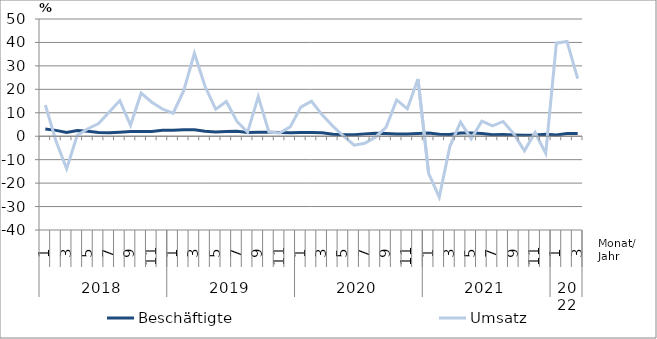
| Category | Beschäftigte | Umsatz |
|---|---|---|
| 0 | 3.1 | 13.3 |
| 1 | 2.5 | -2 |
| 2 | 1.6 | -13.9 |
| 3 | 2.4 | 0.4 |
| 4 | 2.1 | 3.2 |
| 5 | 1.6 | 5.4 |
| 6 | 1.5 | 10.3 |
| 7 | 1.7 | 15.2 |
| 8 | 2 | 4.7 |
| 9 | 2 | 18.4 |
| 10 | 2 | 14.5 |
| 11 | 2.5 | 11.6 |
| 12 | 2.6 | 9.8 |
| 13 | 2.8 | 19.4 |
| 14 | 2.8 | 35.4 |
| 15 | 2.1 | 21.3 |
| 16 | 1.8 | 11.5 |
| 17 | 2 | 14.8 |
| 18 | 2.1 | 6.3 |
| 19 | 1.6 | 1.7 |
| 20 | 1.7 | 16.9 |
| 21 | 1.7 | 1.8 |
| 22 | 1.6 | 1.4 |
| 23 | 1.5 | 4 |
| 24 | 1.6 | 12.4 |
| 25 | 1.6 | 14.9 |
| 26 | 1.5 | 9.1 |
| 27 | 0.8 | 4.3 |
| 28 | 0.6 | 0.1 |
| 29 | 0.6 | -3.8 |
| 30 | 1 | -3 |
| 31 | 1.3 | -0.4 |
| 32 | 1.2 | 3.8 |
| 33 | 1 | 15.5 |
| 34 | 1 | 11.7 |
| 35 | 1.2 | 24.4 |
| 36 | 1.4 | -15.8 |
| 37 | 0.8 | -26 |
| 38 | 0.7 | -4.3 |
| 39 | 1.4 | 6 |
| 40 | 1.4 | -1.1 |
| 41 | 1.2 | 6.4 |
| 42 | 0.6 | 4.4 |
| 43 | 0.7 | 6.3 |
| 44 | 0.5 | 1 |
| 45 | 0.4 | -6.2 |
| 46 | 0.5 | 1.6 |
| 47 | 0.8 | -7.3 |
| 48 | 0.5 | 39.7 |
| 49 | 1.2 | 40.4 |
| 50 | 1.2 | 24.6 |